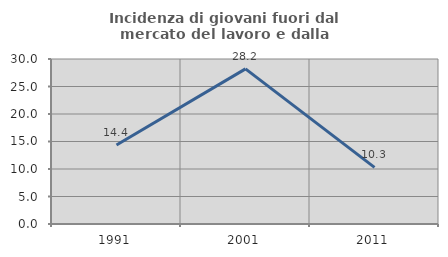
| Category | Incidenza di giovani fuori dal mercato del lavoro e dalla formazione  |
|---|---|
| 1991.0 | 14.371 |
| 2001.0 | 28.205 |
| 2011.0 | 10.294 |